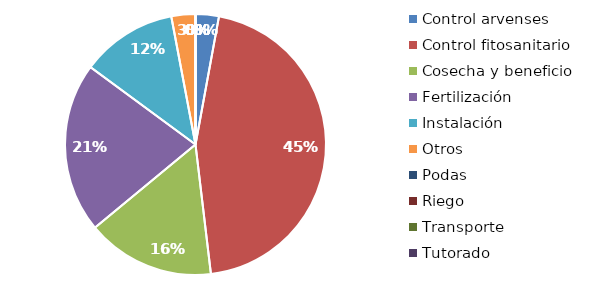
| Category | Valor |
|---|---|
| Control arvenses | 265620 |
| Control fitosanitario | 4158996 |
| Cosecha y beneficio | 1461412.129 |
| Fertilización | 1940641 |
| Instalación | 1096059.096 |
| Otros | 274015 |
| Podas | 0 |
| Riego | 0 |
| Transporte | 0 |
| Tutorado | 0 |